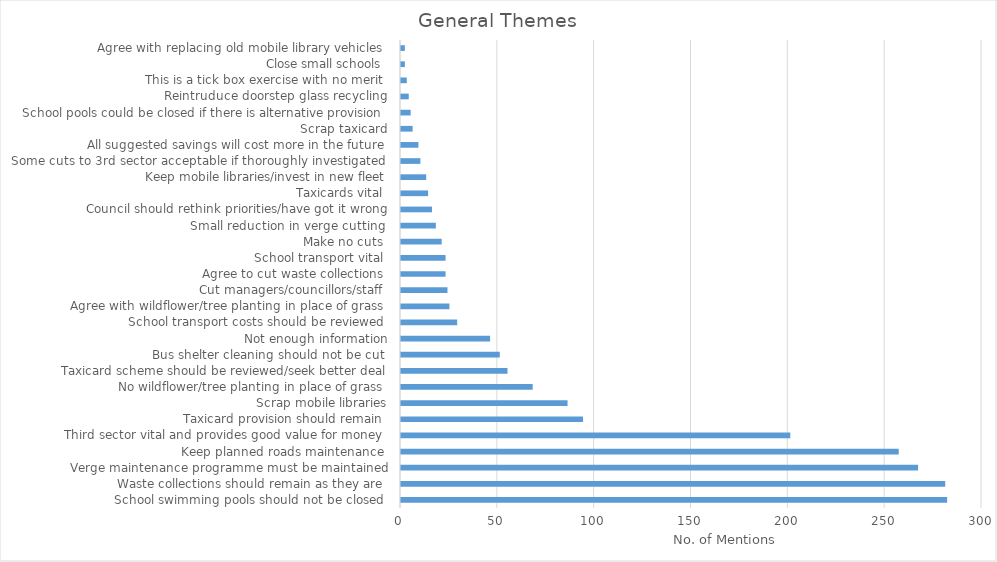
| Category | Series 0 |
|---|---|
| School swimming pools should not be closed  | 282 |
| Waste collections should remain as they are  | 281 |
| Verge maintenance programme must be maintained | 267 |
| Keep planned roads maintenance  | 257 |
| Third sector vital and provides good value for money  | 201 |
| Taxicard provision should remain  | 94 |
| Scrap mobile libraries | 86 |
| No wildflower/tree planting in place of grass  | 68 |
| Taxicard scheme should be reviewed/seek better deal | 55 |
| Bus shelter cleaning should not be cut  | 51 |
| Not enough information | 46 |
| School transport costs should be reviewed  | 29 |
| Agree with wildflower/tree planting in place of grass  | 25 |
| Cut managers/councillors/staff  | 24 |
| Agree to cut waste collections  | 23 |
| School transport vital  | 23 |
| Make no cuts  | 21 |
| Small reduction in verge cutting  | 18 |
| Council should rethink priorities/have got it wrong | 16 |
| Taxicards vital  | 14 |
| Keep mobile libraries/invest in new fleet | 13 |
| Some cuts to 3rd sector acceptable if thoroughly investigated  | 10 |
| All suggested savings will cost more in the future  | 9 |
| Scrap taxicard | 6 |
| School pools could be closed if there is alternative provision  | 5 |
| Reintruduce doorstep glass recycling | 4 |
| This is a tick box exercise with no merit  | 3 |
| Close small schools  | 2 |
| Agree with replacing old mobile library vehicles  | 2 |